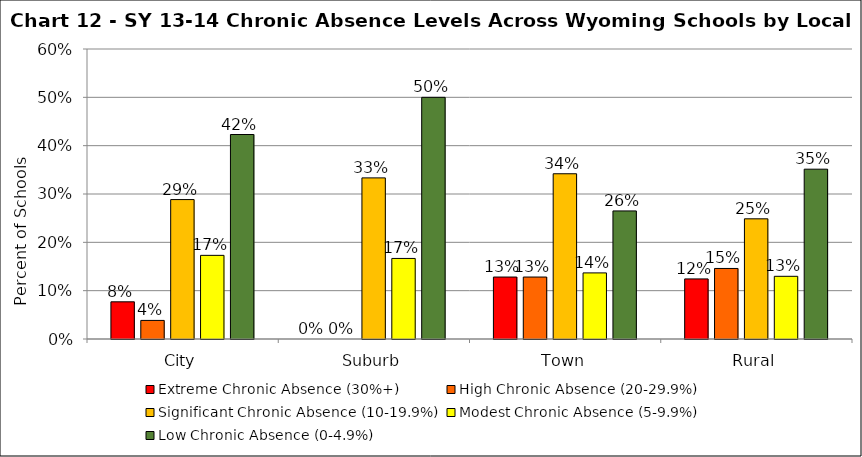
| Category | Extreme Chronic Absence (30%+) | High Chronic Absence (20-29.9%) | Significant Chronic Absence (10-19.9%) | Modest Chronic Absence (5-9.9%) | Low Chronic Absence (0-4.9%) |
|---|---|---|---|---|---|
| 0 | 0.077 | 0.038 | 0.288 | 0.173 | 0.423 |
| 1 | 0 | 0 | 0.333 | 0.167 | 0.5 |
| 2 | 0.128 | 0.128 | 0.342 | 0.137 | 0.265 |
| 3 | 0.124 | 0.146 | 0.249 | 0.13 | 0.351 |